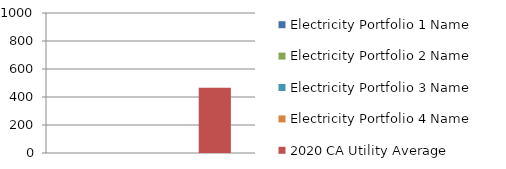
| Category | Electricity Portfolio 1 Name | Electricity Portfolio 2 Name | Electricity Portfolio 3 Name | Electricity Portfolio 4 Name | 2020 CA Utility Average |
|---|---|---|---|---|---|
| 0 | 0 | 0 | 0 | 0 | 466 |